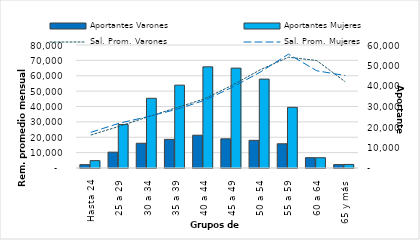
| Category | Aportantes Varones | Aportantes Mujeres |
|---|---|---|
| Hasta 24 | 1636 | 3600 |
| 25 a 29 | 7735 | 21223 |
| 30 a 34 | 12067 | 34002 |
| 35 a 39 | 13976 | 40414 |
| 40 a 44 | 15991 | 49344 |
| 45 a 49 | 14241 | 48722 |
| 50 a 54 | 13499 | 43361 |
| 55 a 59 | 11818 | 29592 |
| 60 a 64 | 5036 | 5018 |
| 65 y más | 1666 | 1744 |